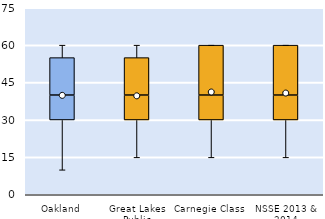
| Category | 25th | 50th | 75th |
|---|---|---|---|
| Oakland | 30 | 10 | 15 |
| Great Lakes Public | 30 | 10 | 15 |
| Carnegie Class | 30 | 10 | 20 |
| NSSE 2013 & 2014 | 30 | 10 | 20 |